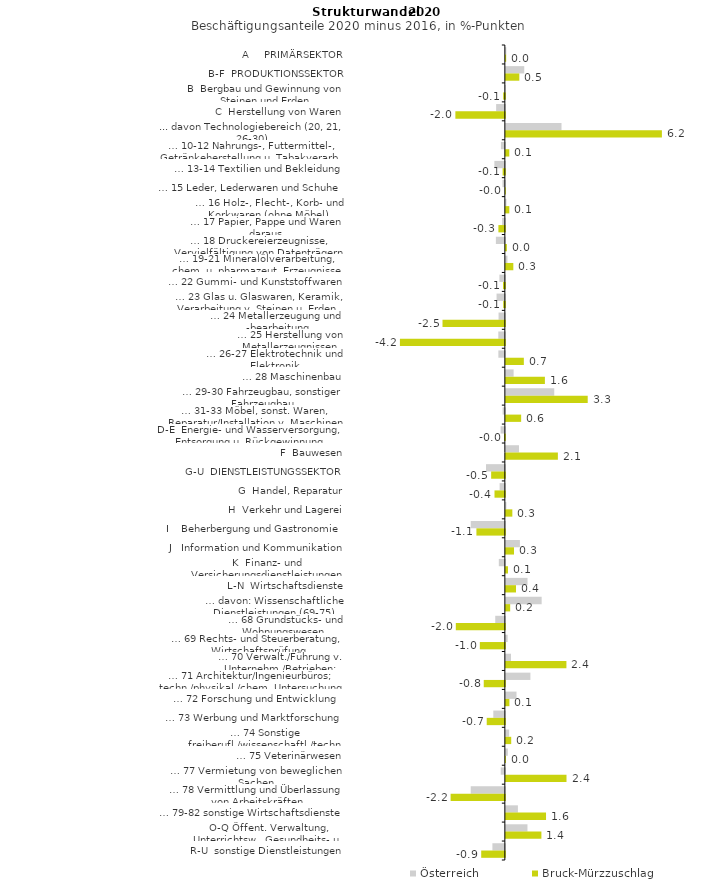
| Category | Österreich | Bruck-Mürzzuschlag |
|---|---|---|
| A     PRIMÄRSEKTOR | 0.018 | 0.013 |
| B-F  PRODUKTIONSSEKTOR | 0.731 | 0.536 |
| B  Bergbau und Gewinnung von Steinen und Erden | -0.006 | -0.066 |
| C  Herstellung von Waren | -0.347 | -1.968 |
| ... davon Technologiebereich (20, 21, 26-30) | 2.213 | 6.206 |
| … 10-12 Nahrungs-, Futtermittel-, Getränkeherstellung u. Tabakverarb. | -0.156 | 0.137 |
| … 13-14 Textilien und Bekleidung | -0.417 | -0.088 |
| … 15 Leder, Lederwaren und Schuhe | -0.095 | 0 |
| … 16 Holz-, Flecht-, Korb- und Korkwaren (ohne Möbel)  | 0.023 | 0.137 |
| … 17 Papier, Pappe und Waren daraus  | -0.11 | -0.257 |
| … 18 Druckereierzeugnisse, Vervielfältigung von Datenträgern | -0.357 | 0.041 |
| … 19-21 Mineralölverarbeitung, chem. u. pharmazeut. Erzeugnisse | 0.063 | 0.297 |
| … 22 Gummi- und Kunststoffwaren | -0.217 | -0.073 |
| … 23 Glas u. Glaswaren, Keramik, Verarbeitung v. Steinen u. Erden  | -0.33 | -0.065 |
| … 24 Metallerzeugung und -bearbeitung | -0.251 | -2.48 |
| … 25 Herstellung von Metallerzeugnissen  | -0.261 | -4.174 |
| … 26-27 Elektrotechnik und Elektronik | -0.258 | 0.715 |
| … 28 Maschinenbau | 0.309 | 1.553 |
| … 29-30 Fahrzeugbau, sonstiger Fahrzeugbau | 1.924 | 3.256 |
| … 31-33 Möbel, sonst. Waren, Reparatur/Installation v. Maschinen | -0.089 | 0.608 |
| D-E  Energie- und Wasserversorgung, Entsorgung u. Rückgewinnung | -0.17 | -0.035 |
| F  Bauwesen | 0.522 | 2.069 |
| G-U  DIENSTLEISTUNGSSEKTOR | -0.749 | -0.545 |
| G  Handel, Reparatur | -0.208 | -0.412 |
| H  Verkehr und Lagerei | 0.02 | 0.258 |
| I    Beherbergung und Gastronomie | -1.357 | -1.131 |
| J   Information und Kommunikation | 0.559 | 0.325 |
| K  Finanz- und Versicherungsdienstleistungen | -0.241 | 0.085 |
| L-N  Wirtschaftsdienste | 0.862 | 0.403 |
| … davon: Wissenschaftliche Dienstleistungen (69-75) | 1.424 | 0.172 |
| … 68 Grundstücks- und Wohnungswesen  | -0.382 | -1.95 |
| … 69 Rechts- und Steuerberatung, Wirtschaftsprüfung | 0.071 | -0.995 |
| … 70 Verwalt./Führung v. Unternehm./Betrieben; Unternehmensberat. | 0.205 | 2.409 |
| … 71 Architektur/Ingenieurbüros; techn./physikal./chem. Untersuchung | 0.976 | -0.84 |
| … 72 Forschung und Entwicklung  | 0.423 | 0.141 |
| … 73 Werbung und Marktforschung | -0.459 | -0.721 |
| … 74 Sonstige freiberufl./wissenschaftl./techn. Tätigkeiten | 0.13 | 0.213 |
| … 75 Veterinärwesen | 0.078 | 0.003 |
| … 77 Vermietung von beweglichen Sachen  | -0.163 | 2.412 |
| … 78 Vermittlung und Überlassung von Arbeitskräften | -1.357 | -2.158 |
| … 79-82 sonstige Wirtschaftsdienste | 0.479 | 1.598 |
| O-Q Öffent. Verwaltung, Unterrichtsw., Gesundheits- u. Sozialwesen | 0.859 | 1.414 |
| R-U  sonstige Dienstleistungen | -0.495 | -0.941 |